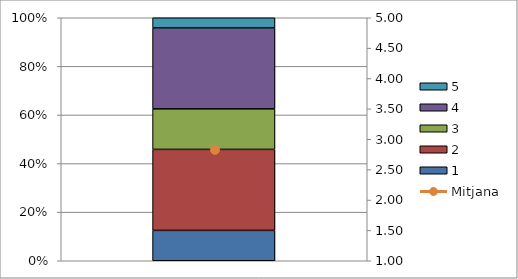
| Category | 1 | 2 | 3 | 4 | 5 |
|---|---|---|---|---|---|
| 0 | 6 | 16 | 8 | 16 | 2 |